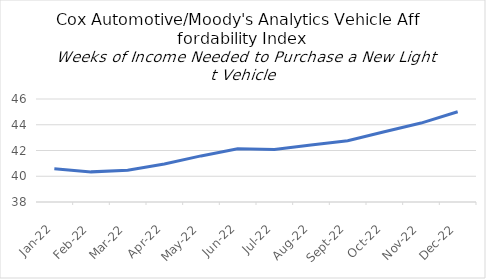
| Category | Series 0 | Series 1 | Series 2 | Series 3 |
|---|---|---|---|---|
| 2022-01-31 |  |  |  | 40.58 |
| 2022-02-28 |  |  |  | 40.34 |
| 2022-03-31 |  |  |  | 40.46 |
| 2022-04-30 |  |  |  | 40.95 |
| 2022-05-31 |  |  |  | 41.58 |
| 2022-06-30 |  |  |  | 42.13 |
| 2022-07-31 |  |  |  | 42.08 |
| 2022-08-31 |  |  |  | 42.42 |
| 2022-09-30 |  |  |  | 42.76 |
| 2022-10-31 |  |  |  | 43.46 |
| 2022-11-30 |  |  |  | 44.13 |
| 2022-12-31 |  |  |  | 45.01 |